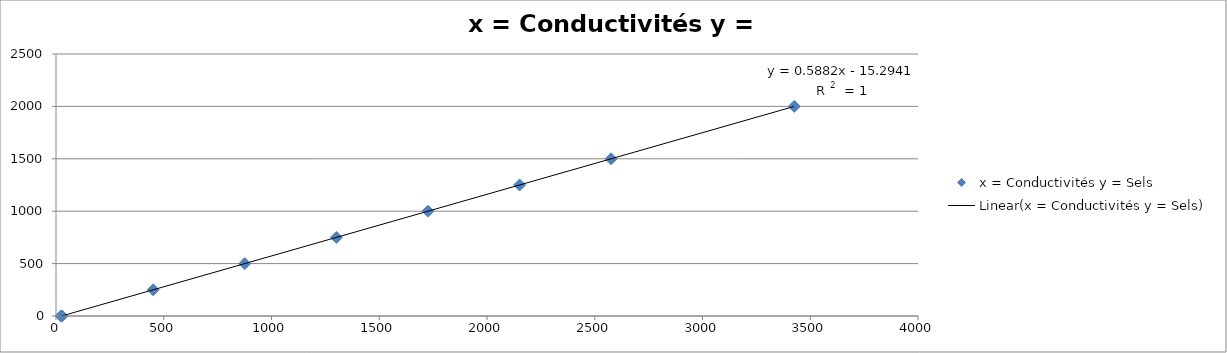
| Category | x = Conductivités y = Sels |
|---|---|
| 26.0 | 0 |
| 451.0 | 250 |
| 876.0 | 500 |
| 1301.0 | 750 |
| 1726.0 | 1000 |
| 2151.0 | 1250 |
| 2576.0 | 1500 |
| 26.0 | 0 |
| 26.0 | 0 |
| 26.0 | 0 |
| 26.0 | 0 |
| 26.0 | 0 |
| 26.0 | 0 |
| 26.0 | 0 |
| 26.0 | 0 |
| 3426.0 | 2000 |